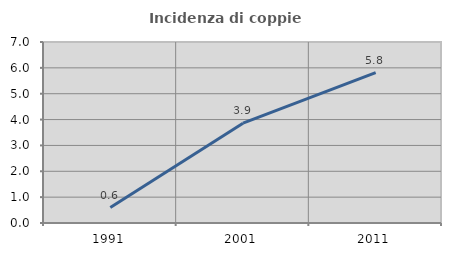
| Category | Incidenza di coppie miste |
|---|---|
| 1991.0 | 0.595 |
| 2001.0 | 3.861 |
| 2011.0 | 5.815 |